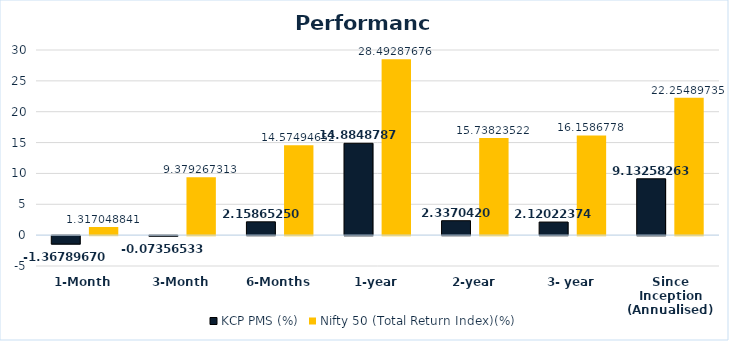
| Category | KCP PMS (%) | Nifty 50 (Total Return Index)(%) |
|---|---|---|
| 1-Month | -1.368 | 1.317 |
| 3-Month | -0.074 | 9.379 |
| 6-Months | 2.159 | 14.575 |
| 1-year | 14.885 | 28.493 |
| 2-year | 2.337 | 15.738 |
| 3- year | 2.12 | 16.159 |
| Since Inception (Annualised) | 9.133 | 22.255 |